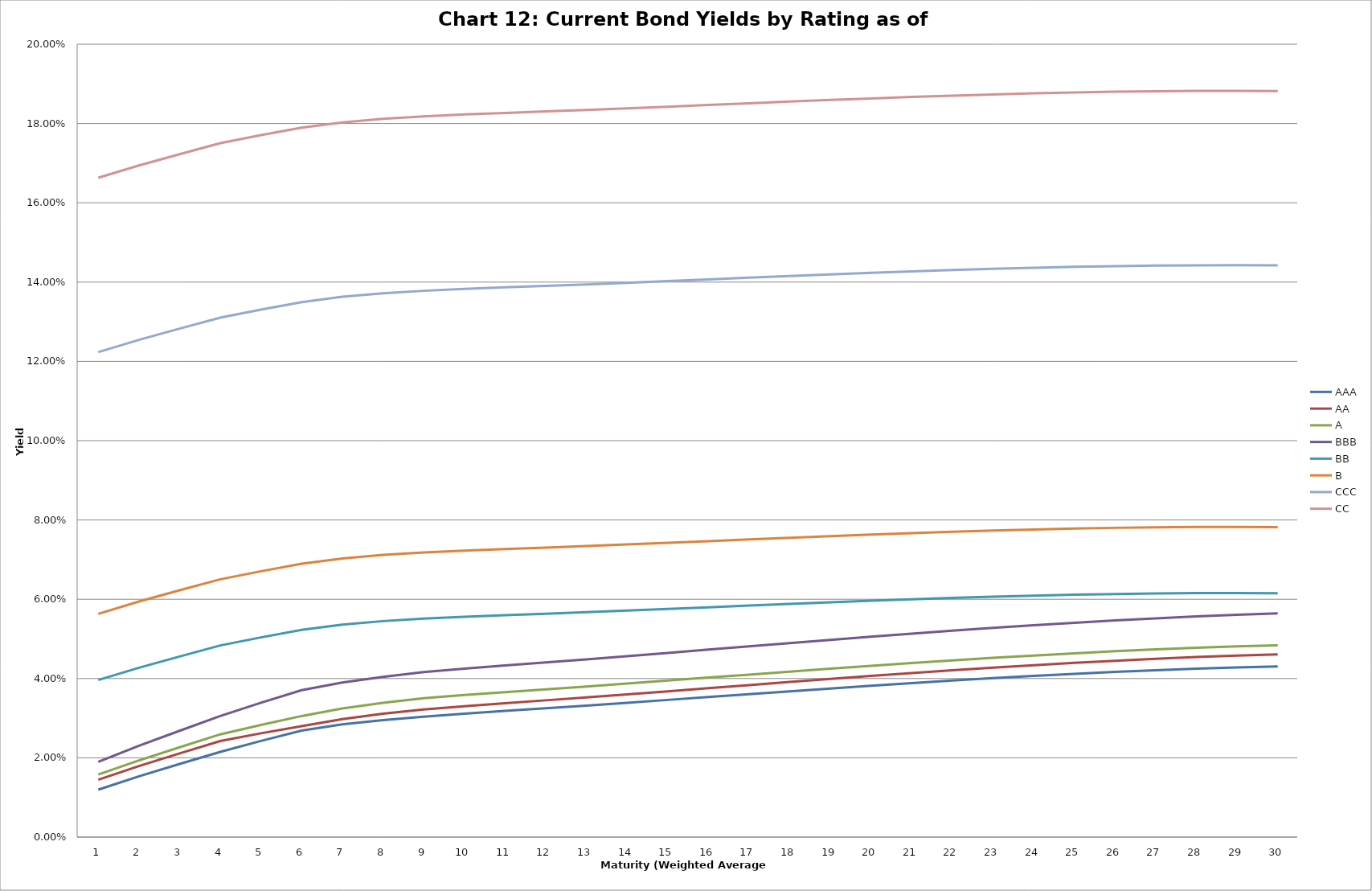
| Category | AAA | AA | A | BBB | BB | B | CCC | CC |
|---|---|---|---|---|---|---|---|---|
| 0 | 0.012 | 0.014 | 0.016 | 0.019 | 0.04 | 0.056 | 0.122 | 0.166 |
| 1 | 0.015 | 0.018 | 0.019 | 0.023 | 0.043 | 0.059 | 0.125 | 0.169 |
| 2 | 0.018 | 0.021 | 0.023 | 0.027 | 0.046 | 0.062 | 0.128 | 0.172 |
| 3 | 0.022 | 0.024 | 0.026 | 0.031 | 0.048 | 0.065 | 0.131 | 0.175 |
| 4 | 0.024 | 0.026 | 0.028 | 0.034 | 0.05 | 0.067 | 0.133 | 0.177 |
| 5 | 0.027 | 0.028 | 0.031 | 0.037 | 0.052 | 0.069 | 0.135 | 0.179 |
| 6 | 0.028 | 0.03 | 0.032 | 0.039 | 0.054 | 0.07 | 0.136 | 0.18 |
| 7 | 0.03 | 0.031 | 0.034 | 0.04 | 0.054 | 0.071 | 0.137 | 0.181 |
| 8 | 0.03 | 0.032 | 0.035 | 0.042 | 0.055 | 0.072 | 0.138 | 0.182 |
| 9 | 0.031 | 0.033 | 0.036 | 0.042 | 0.056 | 0.072 | 0.138 | 0.182 |
| 10 | 0.032 | 0.034 | 0.037 | 0.043 | 0.056 | 0.073 | 0.139 | 0.183 |
| 11 | 0.033 | 0.035 | 0.037 | 0.044 | 0.056 | 0.073 | 0.139 | 0.183 |
| 12 | 0.033 | 0.035 | 0.038 | 0.045 | 0.057 | 0.073 | 0.139 | 0.183 |
| 13 | 0.034 | 0.036 | 0.039 | 0.046 | 0.057 | 0.074 | 0.14 | 0.184 |
| 14 | 0.035 | 0.037 | 0.039 | 0.046 | 0.058 | 0.074 | 0.14 | 0.184 |
| 15 | 0.035 | 0.038 | 0.04 | 0.047 | 0.058 | 0.075 | 0.141 | 0.185 |
| 16 | 0.036 | 0.038 | 0.041 | 0.048 | 0.058 | 0.075 | 0.141 | 0.185 |
| 17 | 0.037 | 0.039 | 0.042 | 0.049 | 0.059 | 0.076 | 0.142 | 0.186 |
| 18 | 0.037 | 0.04 | 0.042 | 0.05 | 0.059 | 0.076 | 0.142 | 0.186 |
| 19 | 0.038 | 0.041 | 0.043 | 0.051 | 0.06 | 0.076 | 0.142 | 0.186 |
| 20 | 0.039 | 0.041 | 0.044 | 0.051 | 0.06 | 0.077 | 0.143 | 0.187 |
| 21 | 0.039 | 0.042 | 0.045 | 0.052 | 0.06 | 0.077 | 0.143 | 0.187 |
| 22 | 0.04 | 0.043 | 0.045 | 0.053 | 0.061 | 0.077 | 0.143 | 0.187 |
| 23 | 0.041 | 0.043 | 0.046 | 0.053 | 0.061 | 0.078 | 0.144 | 0.188 |
| 24 | 0.041 | 0.044 | 0.046 | 0.054 | 0.061 | 0.078 | 0.144 | 0.188 |
| 25 | 0.042 | 0.044 | 0.047 | 0.055 | 0.061 | 0.078 | 0.144 | 0.188 |
| 26 | 0.042 | 0.045 | 0.047 | 0.055 | 0.061 | 0.078 | 0.144 | 0.188 |
| 27 | 0.042 | 0.045 | 0.048 | 0.056 | 0.062 | 0.078 | 0.144 | 0.188 |
| 28 | 0.043 | 0.046 | 0.048 | 0.056 | 0.062 | 0.078 | 0.144 | 0.188 |
| 29 | 0.043 | 0.046 | 0.048 | 0.056 | 0.062 | 0.078 | 0.144 | 0.188 |